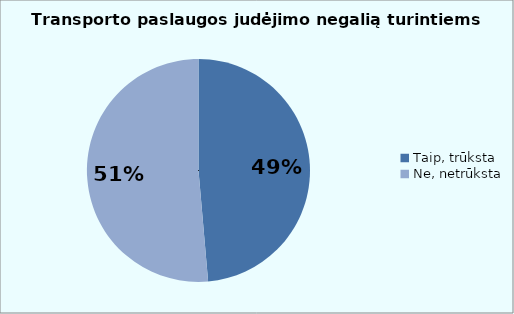
| Category | Series 0 |
|---|---|
| Taip, trūksta | 53 |
| Ne, netrūksta | 56 |